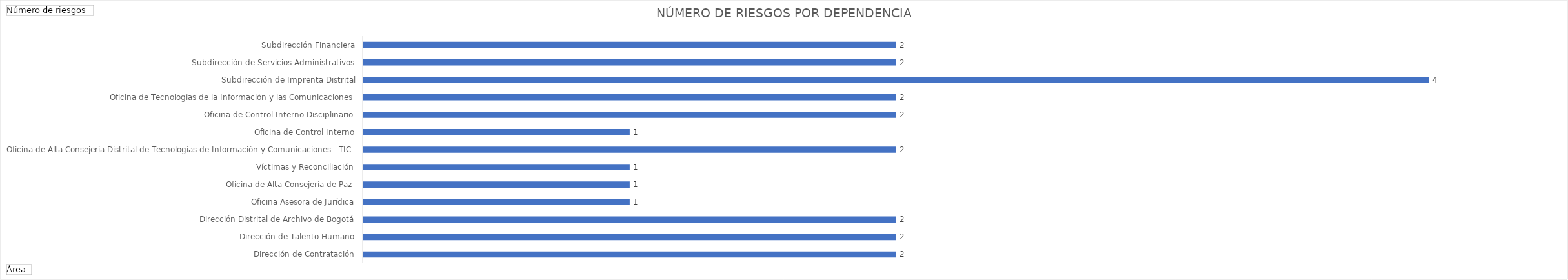
| Category | Total |
|---|---|
| Dirección de Contratación | 2 |
| Dirección de Talento Humano | 2 |
| Dirección Distrital de Archivo de Bogotá | 2 |
| Oficina Asesora de Jurídica | 1 |
| Oficina de Alta Consejería de Paz, Víctimas y Reconciliación | 1 |
| Oficina de Alta Consejería Distrital de Tecnologías de Información y Comunicaciones - TIC | 1 |
| Oficina de Control Interno | 2 |
| Oficina de Control Interno Disciplinario | 1 |
| Oficina de Tecnologías de la Información y las Comunicaciones | 2 |
| Subdirección de Imprenta Distrital | 2 |
| Subdirección de Servicios Administrativos | 4 |
| Subdirección Financiera | 2 |
| Subsecretaría de Servicio a la Ciudadanía | 2 |